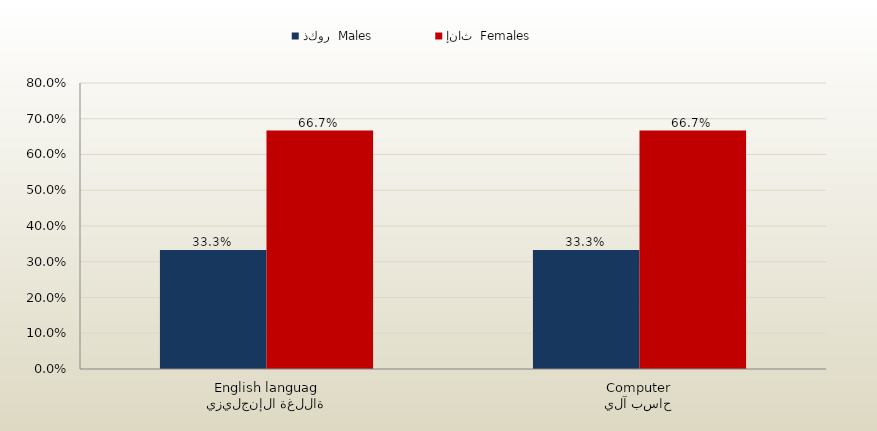
| Category | ذكور  Males | إناث  Females |
|---|---|---|
| اللغة الإنجليزية
English language | 0.333 | 0.667 |
| حاسب آلي
Computer | 0.333 | 0.667 |